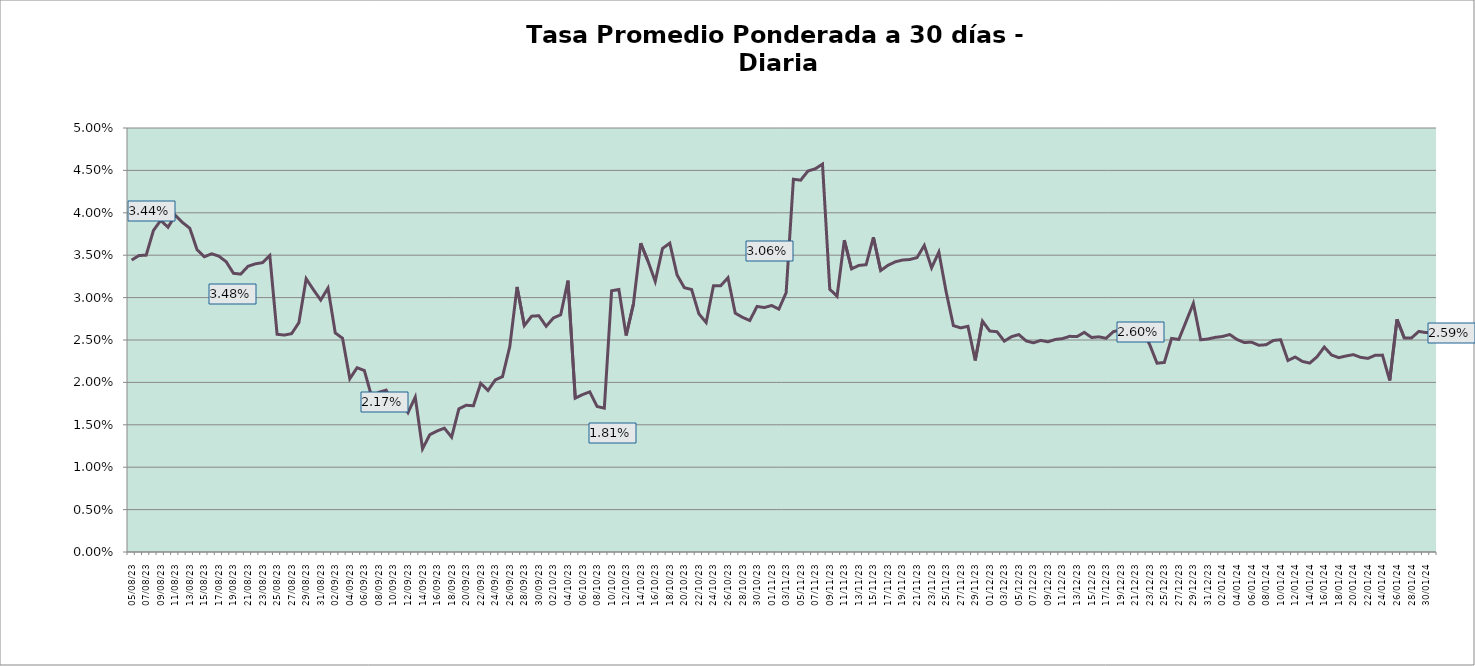
| Category | Tasa a 30 días |
|---|---|
| 2023-08-05 | 0.034 |
| 2023-08-06 | 0.035 |
| 2023-08-07 | 0.035 |
| 2023-08-08 | 0.038 |
| 2023-08-09 | 0.039 |
| 2023-08-10 | 0.038 |
| 2023-08-11 | 0.04 |
| 2023-08-12 | 0.039 |
| 2023-08-13 | 0.038 |
| 2023-08-14 | 0.036 |
| 2023-08-15 | 0.035 |
| 2023-08-16 | 0.035 |
| 2023-08-17 | 0.035 |
| 2023-08-18 | 0.034 |
| 2023-08-19 | 0.033 |
| 2023-08-20 | 0.033 |
| 2023-08-21 | 0.034 |
| 2023-08-22 | 0.034 |
| 2023-08-23 | 0.034 |
| 2023-08-24 | 0.035 |
| 2023-08-25 | 0.026 |
| 2023-08-26 | 0.026 |
| 2023-08-27 | 0.026 |
| 2023-08-28 | 0.027 |
| 2023-08-29 | 0.032 |
| 2023-08-30 | 0.031 |
| 2023-08-31 | 0.03 |
| 2023-09-01 | 0.031 |
| 2023-09-02 | 0.026 |
| 2023-09-03 | 0.025 |
| 2023-09-04 | 0.02 |
| 2023-09-05 | 0.022 |
| 2023-09-06 | 0.021 |
| 2023-09-07 | 0.018 |
| 2023-09-08 | 0.019 |
| 2023-09-09 | 0.019 |
| 2023-09-10 | 0.017 |
| 2023-09-11 | 0.018 |
| 2023-09-12 | 0.016 |
| 2023-09-13 | 0.018 |
| 2023-09-14 | 0.012 |
| 2023-09-15 | 0.014 |
| 2023-09-16 | 0.014 |
| 2023-09-17 | 0.015 |
| 2023-09-18 | 0.014 |
| 2023-09-19 | 0.017 |
| 2023-09-20 | 0.017 |
| 2023-09-21 | 0.017 |
| 2023-09-22 | 0.02 |
| 2023-09-23 | 0.019 |
| 2023-09-24 | 0.02 |
| 2023-09-25 | 0.021 |
| 2023-09-26 | 0.024 |
| 2023-09-27 | 0.031 |
| 2023-09-28 | 0.027 |
| 2023-09-29 | 0.028 |
| 2023-09-30 | 0.028 |
| 2023-10-01 | 0.027 |
| 2023-10-02 | 0.028 |
| 2023-10-03 | 0.028 |
| 2023-10-04 | 0.032 |
| 2023-10-05 | 0.018 |
| 2023-10-06 | 0.019 |
| 2023-10-07 | 0.019 |
| 2023-10-08 | 0.017 |
| 2023-10-09 | 0.017 |
| 2023-10-10 | 0.031 |
| 2023-10-11 | 0.031 |
| 2023-10-12 | 0.026 |
| 2023-10-13 | 0.029 |
| 2023-10-14 | 0.036 |
| 2023-10-15 | 0.034 |
| 2023-10-16 | 0.032 |
| 2023-10-17 | 0.036 |
| 2023-10-18 | 0.036 |
| 2023-10-19 | 0.033 |
| 2023-10-20 | 0.031 |
| 2023-10-21 | 0.031 |
| 2023-10-22 | 0.028 |
| 2023-10-23 | 0.027 |
| 2023-10-24 | 0.031 |
| 2023-10-25 | 0.031 |
| 2023-10-26 | 0.032 |
| 2023-10-27 | 0.028 |
| 2023-10-28 | 0.028 |
| 2023-10-29 | 0.027 |
| 2023-10-30 | 0.029 |
| 2023-10-31 | 0.029 |
| 2023-11-01 | 0.029 |
| 2023-11-02 | 0.029 |
| 2023-11-03 | 0.031 |
| 2023-11-04 | 0.044 |
| 2023-11-05 | 0.044 |
| 2023-11-06 | 0.045 |
| 2023-11-07 | 0.045 |
| 2023-11-08 | 0.046 |
| 2023-11-09 | 0.031 |
| 2023-11-10 | 0.03 |
| 2023-11-11 | 0.037 |
| 2023-11-12 | 0.033 |
| 2023-11-13 | 0.034 |
| 2023-11-14 | 0.034 |
| 2023-11-15 | 0.037 |
| 2023-11-16 | 0.033 |
| 2023-11-17 | 0.034 |
| 2023-11-18 | 0.034 |
| 2023-11-19 | 0.034 |
| 2023-11-20 | 0.034 |
| 2023-11-21 | 0.035 |
| 2023-11-22 | 0.036 |
| 2023-11-23 | 0.034 |
| 2023-11-24 | 0.035 |
| 2023-11-25 | 0.031 |
| 2023-11-26 | 0.027 |
| 2023-11-27 | 0.026 |
| 2023-11-28 | 0.027 |
| 2023-11-29 | 0.023 |
| 2023-11-30 | 0.027 |
| 2023-12-01 | 0.026 |
| 2023-12-02 | 0.026 |
| 2023-12-03 | 0.025 |
| 2023-12-04 | 0.025 |
| 2023-12-05 | 0.026 |
| 2023-12-06 | 0.025 |
| 2023-12-07 | 0.025 |
| 2023-12-08 | 0.025 |
| 2023-12-09 | 0.025 |
| 2023-12-10 | 0.025 |
| 2023-12-11 | 0.025 |
| 2023-12-12 | 0.025 |
| 2023-12-13 | 0.025 |
| 2023-12-14 | 0.026 |
| 2023-12-15 | 0.025 |
| 2023-12-16 | 0.025 |
| 2023-12-17 | 0.025 |
| 2023-12-18 | 0.026 |
| 2023-12-19 | 0.026 |
| 2023-12-20 | 0.026 |
| 2023-12-21 | 0.026 |
| 2023-12-22 | 0.026 |
| 2023-12-23 | 0.024 |
| 2023-12-24 | 0.022 |
| 2023-12-25 | 0.022 |
| 2023-12-26 | 0.025 |
| 2023-12-27 | 0.025 |
| 2023-12-28 | 0.027 |
| 2023-12-29 | 0.029 |
| 2023-12-30 | 0.025 |
| 2023-12-31 | 0.025 |
| 2024-01-01 | 0.025 |
| 2024-01-02 | 0.025 |
| 2024-01-03 | 0.026 |
| 2024-01-04 | 0.025 |
| 2024-01-05 | 0.025 |
| 2024-01-06 | 0.025 |
| 2024-01-07 | 0.024 |
| 2024-01-08 | 0.024 |
| 2024-01-09 | 0.025 |
| 2024-01-10 | 0.025 |
| 2024-01-11 | 0.023 |
| 2024-01-12 | 0.023 |
| 2024-01-13 | 0.022 |
| 2024-01-14 | 0.022 |
| 2024-01-15 | 0.023 |
| 2024-01-16 | 0.024 |
| 2024-01-17 | 0.023 |
| 2024-01-18 | 0.023 |
| 2024-01-19 | 0.023 |
| 2024-01-20 | 0.023 |
| 2024-01-21 | 0.023 |
| 2024-01-22 | 0.023 |
| 2024-01-23 | 0.023 |
| 2024-01-24 | 0.023 |
| 2024-01-25 | 0.02 |
| 2024-01-26 | 0.027 |
| 2024-01-27 | 0.025 |
| 2024-01-28 | 0.025 |
| 2024-01-29 | 0.026 |
| 2024-01-30 | 0.026 |
| 2024-01-31 | 0.026 |